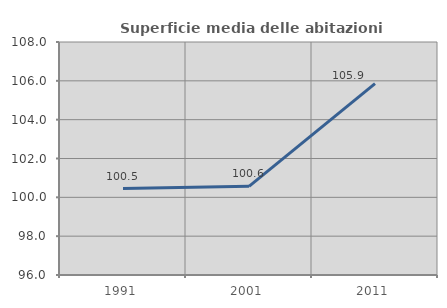
| Category | Superficie media delle abitazioni occupate |
|---|---|
| 1991.0 | 100.454 |
| 2001.0 | 100.569 |
| 2011.0 | 105.854 |